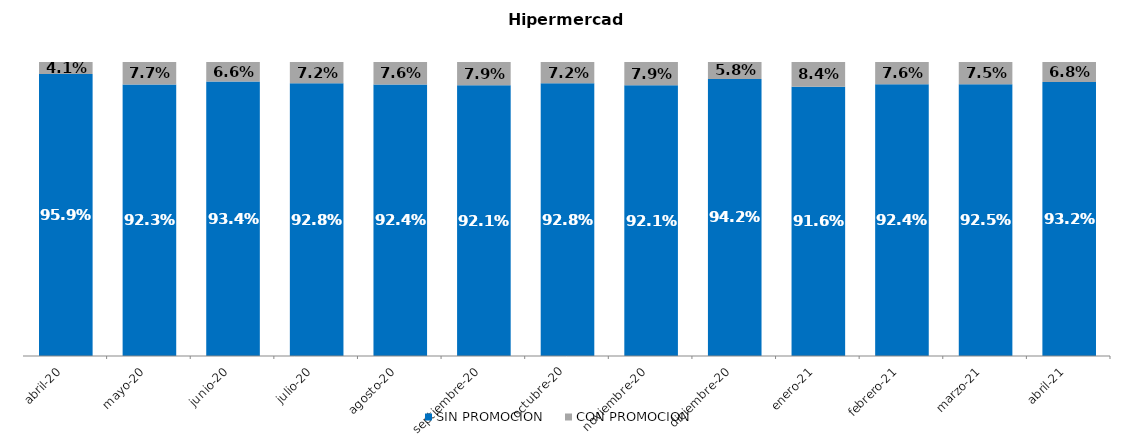
| Category | SIN PROMOCION   | CON PROMOCION   |
|---|---|---|
| 2020-04-01 | 0.959 | 0.041 |
| 2020-05-01 | 0.923 | 0.077 |
| 2020-06-01 | 0.934 | 0.066 |
| 2020-07-01 | 0.928 | 0.072 |
| 2020-08-01 | 0.924 | 0.076 |
| 2020-09-01 | 0.921 | 0.079 |
| 2020-10-01 | 0.928 | 0.072 |
| 2020-11-01 | 0.921 | 0.079 |
| 2020-12-01 | 0.942 | 0.058 |
| 2021-01-01 | 0.916 | 0.084 |
| 2021-02-01 | 0.924 | 0.076 |
| 2021-03-01 | 0.925 | 0.075 |
| 2021-04-01 | 0.932 | 0.068 |